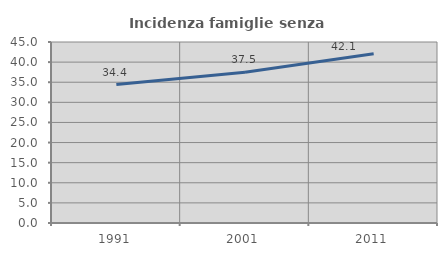
| Category | Incidenza famiglie senza nuclei |
|---|---|
| 1991.0 | 34.426 |
| 2001.0 | 37.456 |
| 2011.0 | 42.088 |